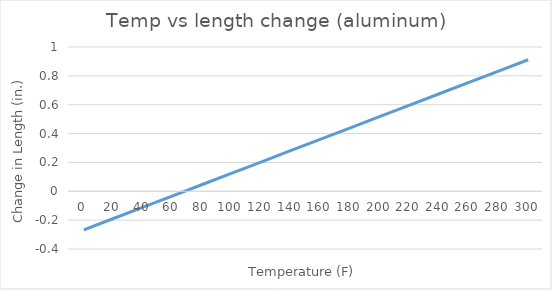
| Category | Temp vs length change |
|---|---|
| 0.0 | -0.267 |
| 20.0 | -0.189 |
| 40.0 | -0.11 |
| 60.0 | -0.031 |
| 80.0 | 0.047 |
| 100.0 | 0.126 |
| 120.0 | 0.204 |
| 140.0 | 0.283 |
| 160.0 | 0.362 |
| 180.0 | 0.44 |
| 200.0 | 0.519 |
| 220.0 | 0.597 |
| 240.0 | 0.676 |
| 260.0 | 0.755 |
| 280.0 | 0.833 |
| 300.0 | 0.912 |